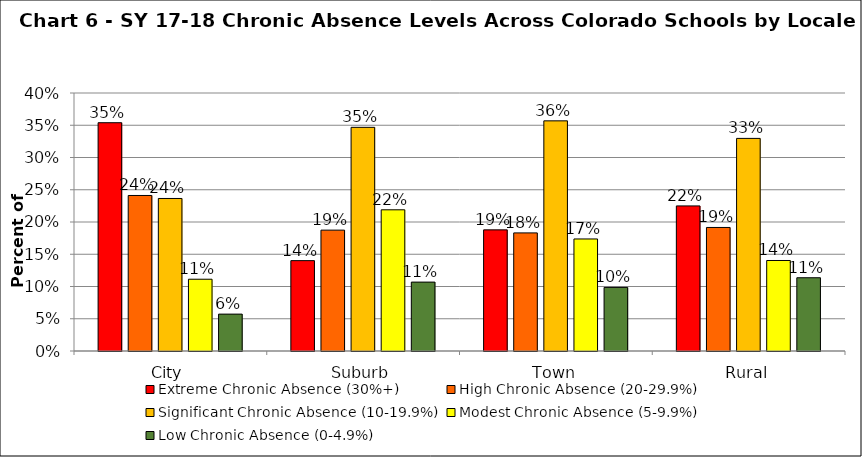
| Category | Extreme Chronic Absence (30%+) | High Chronic Absence (20-29.9%) | Significant Chronic Absence (10-19.9%) | Modest Chronic Absence (5-9.9%) | Low Chronic Absence (0-4.9%) |
|---|---|---|---|---|---|
| 0 | 0.354 | 0.241 | 0.236 | 0.111 | 0.057 |
| 1 | 0.14 | 0.187 | 0.347 | 0.219 | 0.107 |
| 2 | 0.188 | 0.183 | 0.357 | 0.174 | 0.099 |
| 3 | 0.225 | 0.192 | 0.33 | 0.14 | 0.114 |